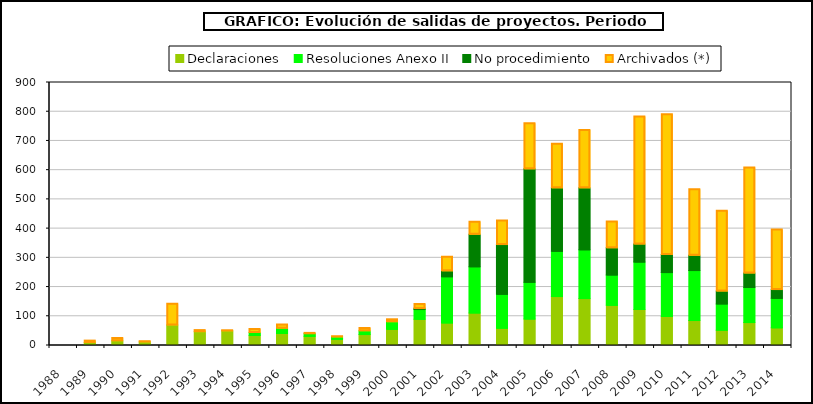
| Category | Declaraciones | Resoluciones Anexo II | No procedimiento | Archivados (*) |
|---|---|---|---|---|
| 1988.0 | 0 | 0 | 0 | 0 |
| 1989.0 | 7 | 0 | 0 | 8 |
| 1990.0 | 13 | 0 | 0 | 11 |
| 1991.0 | 9 | 0 | 0 | 4 |
| 1992.0 | 67 | 0 | 0 | 74 |
| 1993.0 | 44 | 0 | 0 | 7 |
| 1994.0 | 47 | 0 | 0 | 3 |
| 1995.0 | 31 | 10 | 0 | 14 |
| 1996.0 | 38 | 18 | 0 | 14 |
| 1997.0 | 28 | 10 | 0 | 2 |
| 1998.0 | 18 | 8 | 0 | 4 |
| 1999.0 | 34 | 13 | 0 | 11 |
| 2000.0 | 52 | 26 | 0 | 10 |
| 2001.0 | 86 | 35 | 2 | 17 |
| 2002.0 | 74 | 158 | 20 | 50 |
| 2003.0 | 108 | 158 | 111 | 45 |
| 2004.0 | 56 | 116 | 170 | 84 |
| 2005.0 | 87 | 126 | 388 | 158 |
| 2006.0 | 164 | 155 | 217 | 153 |
| 2007.0 | 157 | 167 | 212 | 200 |
| 2008.0 | 134 | 104 | 93 | 92 |
| 2009.0 | 120 | 162 | 62 | 438 |
| 2010.0 | 96 | 150 | 62 | 482 |
| 2011.0 | 82 | 171 | 52 | 228 |
| 2012.0 | 49 | 90 | 44 | 276 |
| 2013.0 | 75 | 120 | 50 | 362 |
| 2014.0 | 57 | 101 | 30 | 207 |